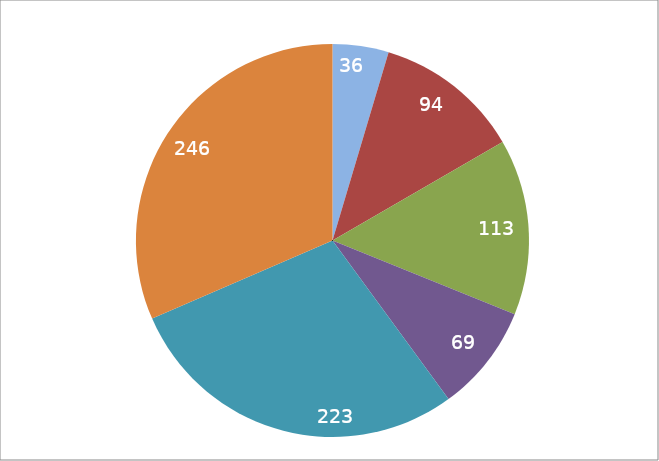
| Category | Series 1 |
|---|---|
| Verarbeitendes Gewerbe | 36 |
| Baugewerbe | 94 |
| Groß-und Einzelhandel2  | 113 |
| Gastgewerbe | 69 |
| Grundstücks- und Wohnungswesen3 und Sonstige Dienstleistungen4 | 223 |
| übrige | 246 |